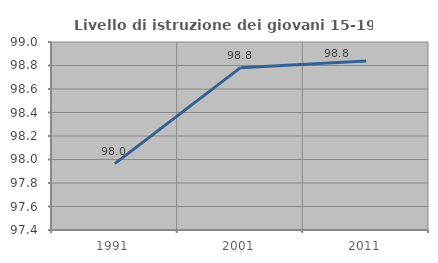
| Category | Livello di istruzione dei giovani 15-19 anni |
|---|---|
| 1991.0 | 97.965 |
| 2001.0 | 98.782 |
| 2011.0 | 98.839 |